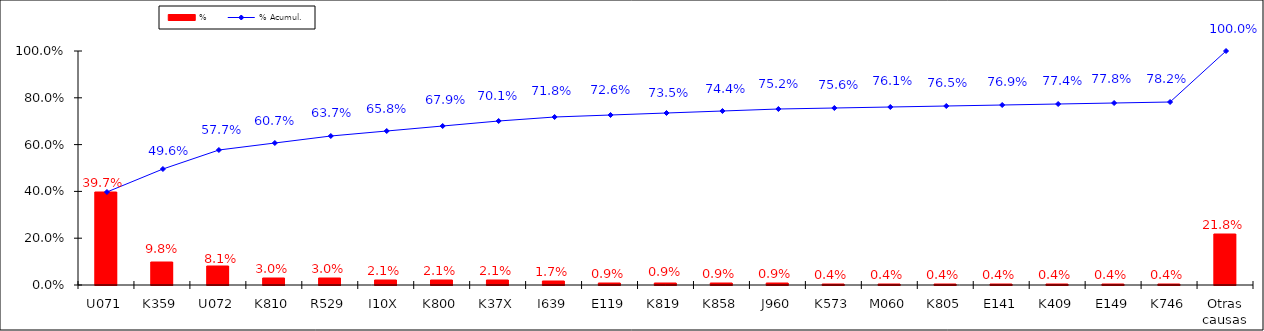
| Category | % |
|---|---|
| U071 | 0.397 |
| K359 | 0.098 |
| U072 | 0.081 |
| K810 | 0.03 |
| R529 | 0.03 |
| I10X | 0.021 |
| K800 | 0.021 |
| K37X | 0.021 |
| I639 | 0.017 |
| E119 | 0.009 |
| K819 | 0.009 |
| K858 | 0.009 |
| J960 | 0.009 |
| K573 | 0.004 |
| M060 | 0.004 |
| K805 | 0.004 |
| E141 | 0.004 |
| K409 | 0.004 |
| E149 | 0.004 |
| K746 | 0.004 |
| Otras causas | 0.218 |